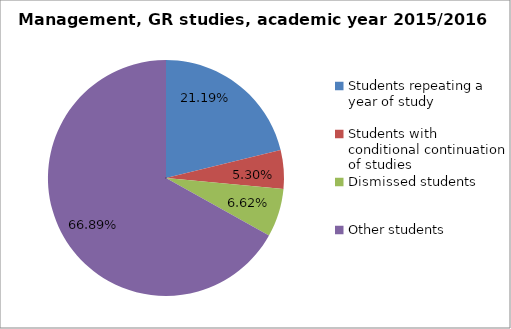
| Category | Series 0 |
|---|---|
| Students repeating a year of study | 32 |
| Students with conditional continuation of studies | 8 |
| Dismissed students | 10 |
| Other students | 101 |